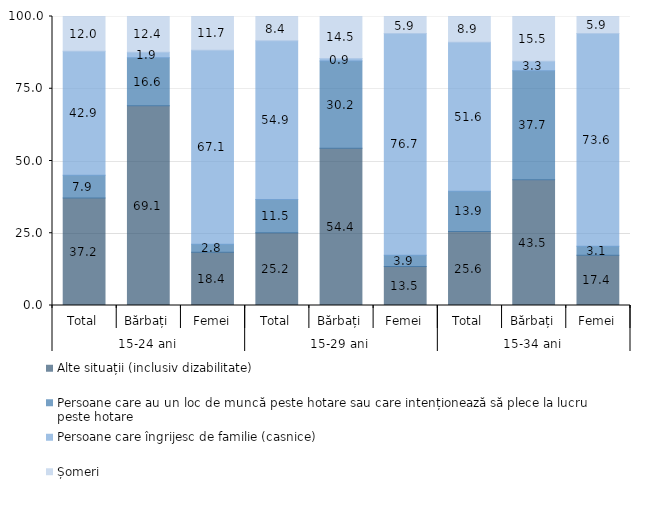
| Category | Alte situații (inclusiv dizabilitate) | Persoane care au un loc de muncă peste hotare sau care intenționează să plece la lucru peste hotare | Persoane care îngrijesc de familie (casnice) | Șomeri |
|---|---|---|---|---|
| 0 | 37.2 | 7.9 | 42.9 | 12 |
| 1 | 69.1 | 16.6 | 1.9 | 12.4 |
| 2 | 18.4 | 2.8 | 67.1 | 11.7 |
| 3 | 25.2 | 11.5 | 54.9 | 8.4 |
| 4 | 54.4 | 30.2 | 0.9 | 14.5 |
| 5 | 13.5 | 3.9 | 76.7 | 5.9 |
| 6 | 25.6 | 13.9 | 51.6 | 8.9 |
| 7 | 43.5 | 37.7 | 3.3 | 15.5 |
| 8 | 17.4 | 3.1 | 73.6 | 5.9 |